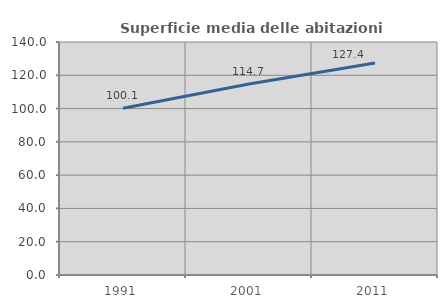
| Category | Superficie media delle abitazioni occupate |
|---|---|
| 1991.0 | 100.147 |
| 2001.0 | 114.716 |
| 2011.0 | 127.382 |